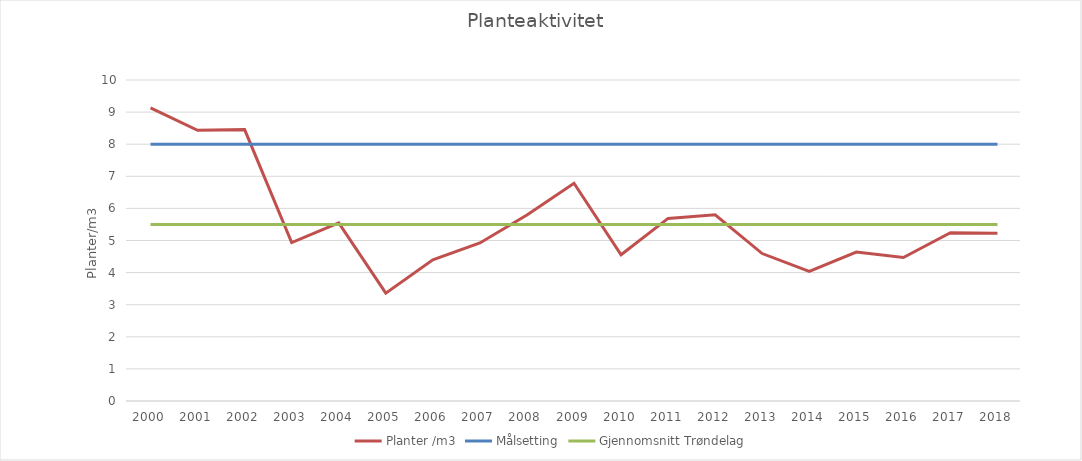
| Category | Planter /m3 | Målsetting | Gjennomsnitt Trøndelag |
|---|---|---|---|
| 2000.0 | 9.131 | 8 | 5.5 |
| 2001.0 | 8.432 | 8 | 5.5 |
| 2002.0 | 8.454 | 8 | 5.5 |
| 2003.0 | 4.935 | 8 | 5.5 |
| 2004.0 | 5.548 | 8 | 5.5 |
| 2005.0 | 3.359 | 8 | 5.5 |
| 2006.0 | 4.398 | 8 | 5.5 |
| 2007.0 | 4.922 | 8 | 5.5 |
| 2008.0 | 5.791 | 8 | 5.5 |
| 2009.0 | 6.782 | 8 | 5.5 |
| 2010.0 | 4.554 | 8 | 5.5 |
| 2011.0 | 5.688 | 8 | 5.5 |
| 2012.0 | 5.802 | 8 | 5.5 |
| 2013.0 | 4.594 | 8 | 5.5 |
| 2014.0 | 4.041 | 8 | 5.5 |
| 2015.0 | 4.639 | 8 | 5.5 |
| 2016.0 | 4.47 | 8 | 5.5 |
| 2017.0 | 5.243 | 8 | 5.5 |
| 2018.0 | 5.224 | 8 | 5.5 |